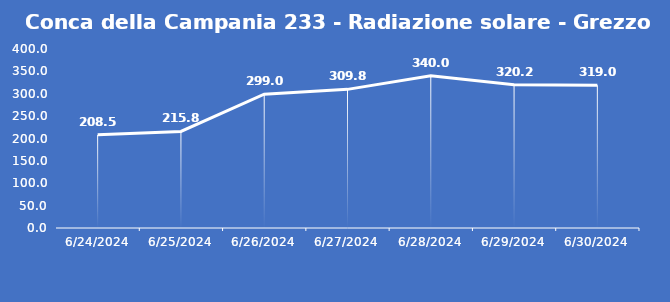
| Category | Conca della Campania 233 - Radiazione solare - Grezzo (W/m2) |
|---|---|
| 6/24/24 | 208.5 |
| 6/25/24 | 215.8 |
| 6/26/24 | 299 |
| 6/27/24 | 309.8 |
| 6/28/24 | 340 |
| 6/29/24 | 320.2 |
| 6/30/24 | 319 |